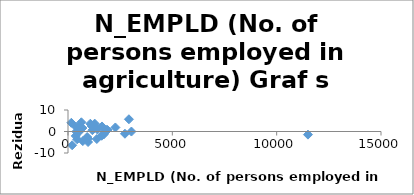
| Category | Series 0 |
|---|---|
| 400.0 | -0.043 |
| 710.0 | -4.463 |
| 1610.0 | -1.976 |
| 500.0 | -0.43 |
| 640.0 | 4.28 |
| 920.0 | -2.563 |
| 1890.0 | 0.698 |
| 3040.0 | -0.018 |
| 2730.0 | -1.041 |
| 1850.0 | 0.704 |
| 2920.0 | 5.697 |
| 1070.0 | 3.612 |
| 160.0 | 4.051 |
| 380.0 | 2.202 |
| 1140.0 | 2.49 |
| 690.0 | 1.611 |
| 1170.0 | 0.608 |
| 1280.0 | 3.654 |
| 2270.0 | 1.87 |
| 960.0 | -4.885 |
| 1710.0 | -1.406 |
| 1410.0 | 0.927 |
| 200.0 | -6.394 |
| 960.0 | -3.336 |
| 11500.0 | -1.458 |
| 1380.0 | -3.493 |
| 530.0 | 2.445 |
| 370.0 | -2.068 |
| 440.0 | -3.622 |
| 1630.0 | 2.347 |